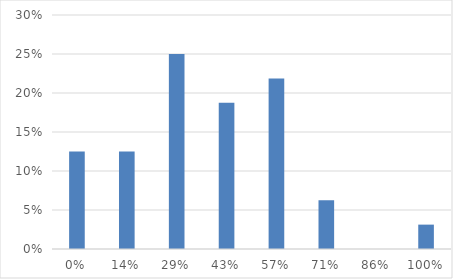
| Category | Series 0 |
|---|---|
| 0.0 | 0.125 |
| 0.14285714285714285 | 0.125 |
| 0.2857142857142857 | 0.25 |
| 0.42857142857142855 | 0.188 |
| 0.5714285714285714 | 0.219 |
| 0.7142857142857143 | 0.062 |
| 0.8571428571428572 | 0 |
| 1.0 | 0.031 |